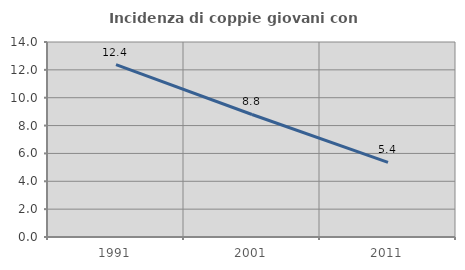
| Category | Incidenza di coppie giovani con figli |
|---|---|
| 1991.0 | 12.37 |
| 2001.0 | 8.796 |
| 2011.0 | 5.361 |